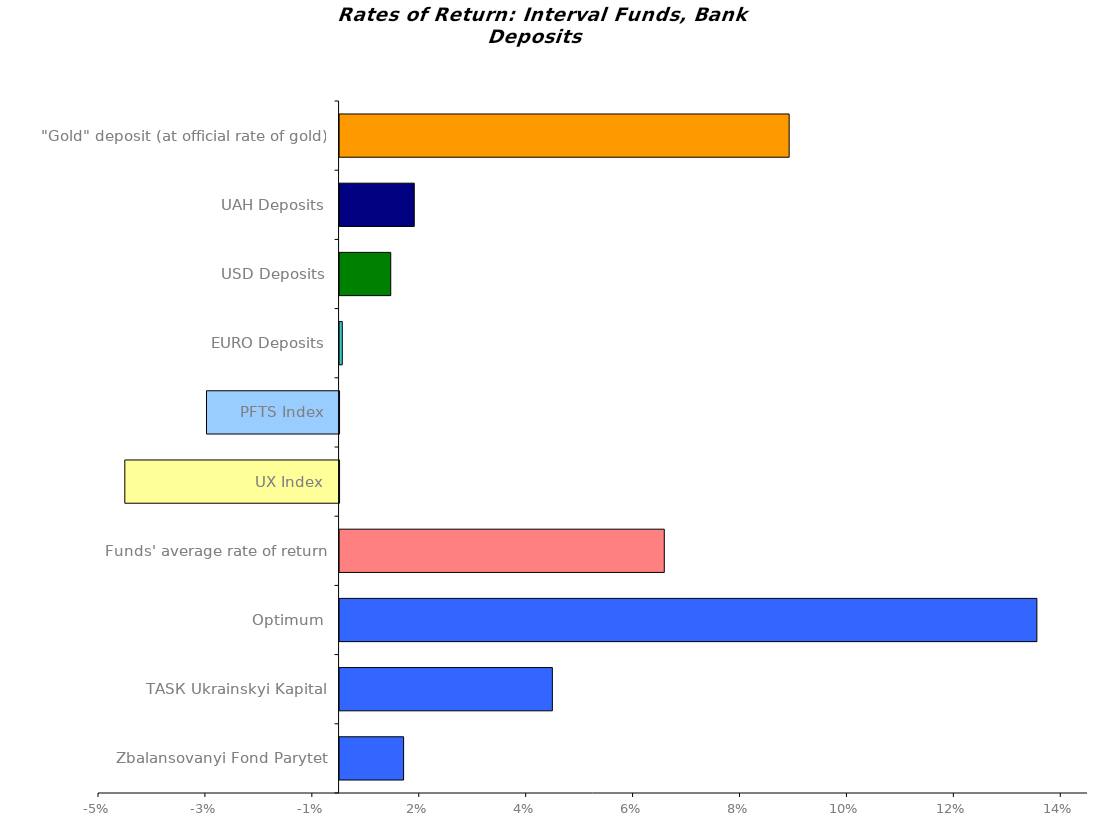
| Category | Series 0 |
|---|---|
| Zbalansovanyi Fond Parytet | 0.012 |
| ТАSК Ukrainskyi Kapital | 0.04 |
| Optimum | 0.13 |
| Funds' average rate of return | 0.061 |
| UX Index | -0.04 |
| PFTS Index | -0.025 |
| EURO Deposits | 0.001 |
| USD Deposits | 0.01 |
| UAH Deposits | 0.014 |
| "Gold" deposit (at official rate of gold) | 0.084 |